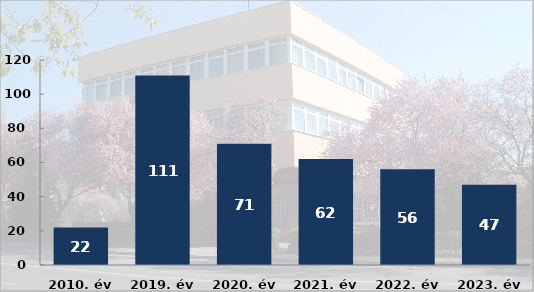
| Category | Előállítások száma |
|---|---|
| 2010. év | 22 |
| 2019. év | 111 |
| 2020. év | 71 |
| 2021. év | 62 |
| 2022. év | 56 |
| 2023. év | 47 |